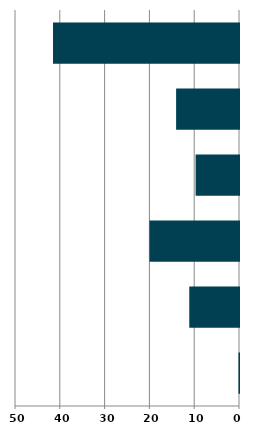
| Category | Series 0 |
|---|---|
| 0 | 0.11 |
| 1 | 11.102 |
| 2 | 19.985 |
| 3 | 9.685 |
| 4 | 14.038 |
| 5 | 41.514 |